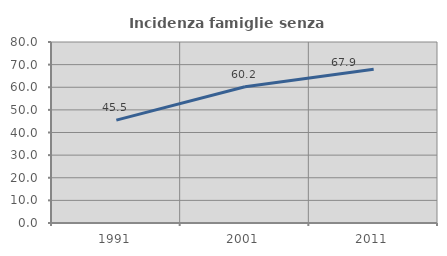
| Category | Incidenza famiglie senza nuclei |
|---|---|
| 1991.0 | 45.455 |
| 2001.0 | 60.194 |
| 2011.0 | 67.91 |